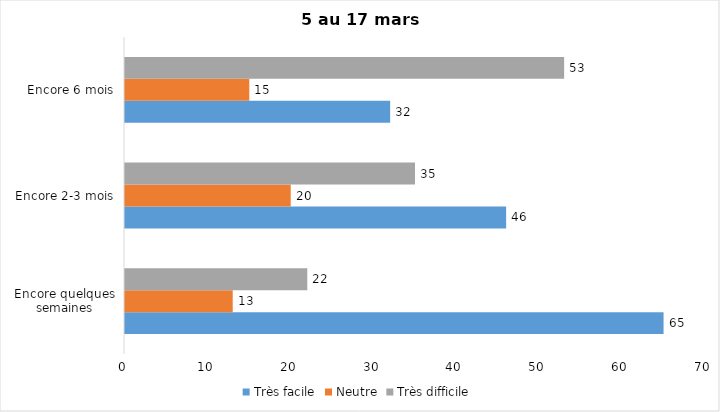
| Category | Très facile | Neutre | Très difficile |
|---|---|---|---|
| Encore quelques semaines | 65 | 13 | 22 |
| Encore 2-3 mois | 46 | 20 | 35 |
| Encore 6 mois | 32 | 15 | 53 |